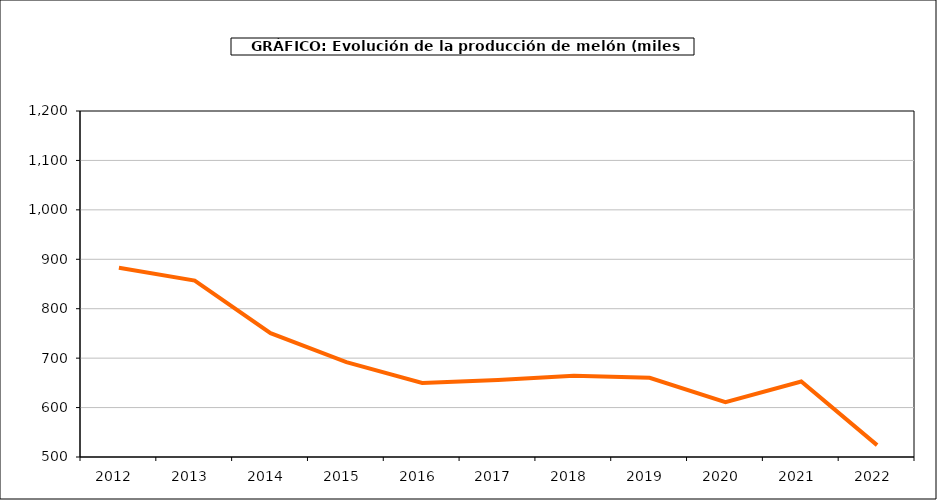
| Category | producción |
|---|---|
| 2012.0 | 882.869 |
| 2013.0 | 856.951 |
| 2014.0 | 750.592 |
| 2015.0 | 692.056 |
| 2016.0 | 649.767 |
| 2017.0 | 655.677 |
| 2018.0 | 664.353 |
| 2019.0 | 660.191 |
| 2020.0 | 610.978 |
| 2021.0 | 652.603 |
| 2022.0 | 524.035 |